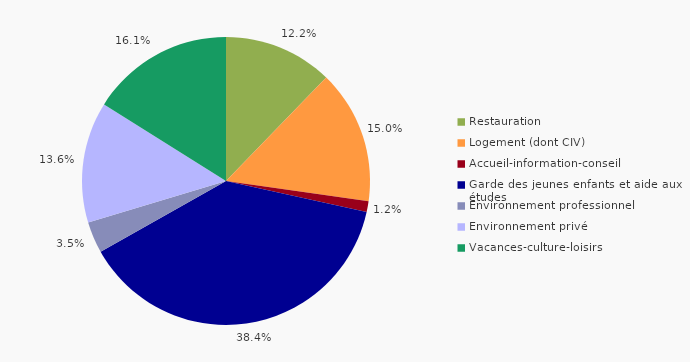
| Category | Figue 10.4 - Répartion des dépenses d'ASIA du programme "Soutien à la politique de l'éducation nationale" par type, en 2015 |
|---|---|
| Restauration | 0.122 |
| Logement (dont CIV)  | 0.15 |
| Accueil-information-conseil | 0.012 |
| Garde des jeunes enfants et aide aux études | 0.384 |
| Environnement professionnel | 0.035 |
| Environnement privé | 0.136 |
| Vacances-culture-loisirs | 0.161 |